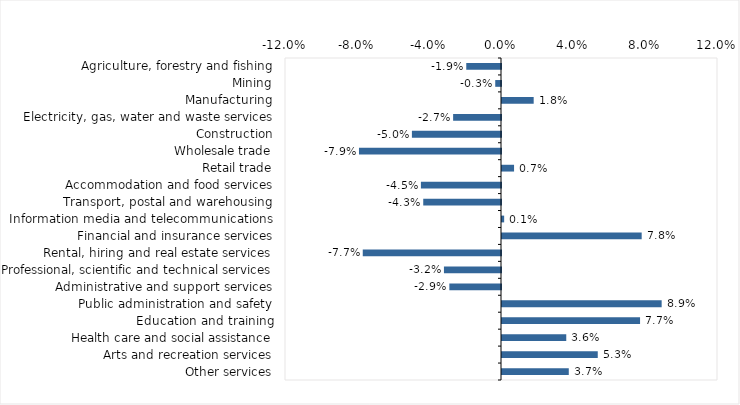
| Category | This week |
|---|---|
| Agriculture, forestry and fishing | -0.019 |
| Mining | -0.003 |
| Manufacturing | 0.018 |
| Electricity, gas, water and waste services | -0.027 |
| Construction | -0.05 |
| Wholesale trade | -0.079 |
| Retail trade | 0.007 |
| Accommodation and food services | -0.044 |
| Transport, postal and warehousing | -0.043 |
| Information media and telecommunications | 0.001 |
| Financial and insurance services | 0.078 |
| Rental, hiring and real estate services | -0.077 |
| Professional, scientific and technical services | -0.032 |
| Administrative and support services | -0.029 |
| Public administration and safety | 0.089 |
| Education and training | 0.077 |
| Health care and social assistance | 0.036 |
| Arts and recreation services | 0.053 |
| Other services | 0.037 |